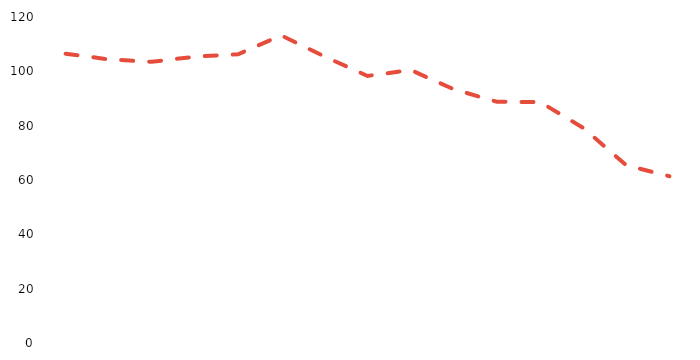
| Category | Series 0 |
|---|---|
| 0 | 106.5 |
| 1 | 104.4 |
| 2 | 103.5 |
| 3 | 105.4 |
| 4 | 106.3 |
| 5 | 113.2 |
| 6 | 105.5 |
| 7 | 98.3 |
| 8 | 100.5 |
| 9 | 93.4 |
| 10 | 88.8 |
| 11 | 88.7 |
| 12 | 79.2 |
| 13 | 65.4 |
| 14 | 61.4 |